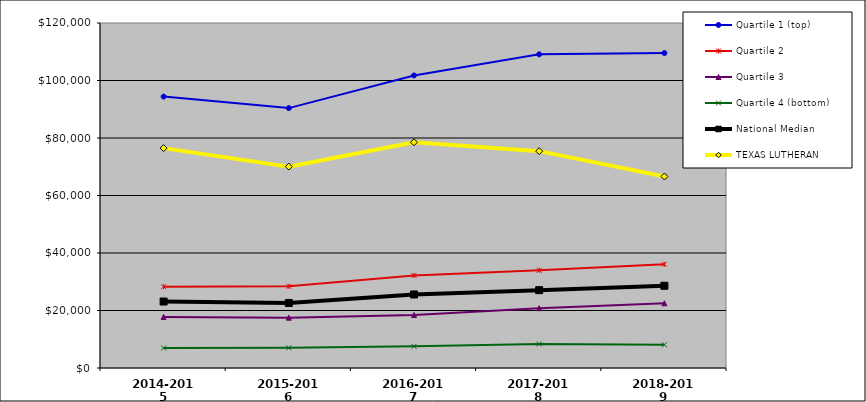
| Category | Quartile 1 (top) | Quartile 2 | Quartile 3 | Quartile 4 (bottom) | National Median | TEXAS LUTHERAN |
|---|---|---|---|---|---|---|
| 2014-2015 | 94399.01 | 28261.992 | 17755.456 | 6924.092 | 23117.708 | 76478.341 |
| 2015-2016 | 90397.525 | 28392.69 | 17505.731 | 7027.323 | 22619.893 | 70047.888 |
| 2016-2017 | 101759.222 | 32192.978 | 18460.041 | 7536.846 | 25581.053 | 78508.712 |
| 2017-2018 | 109099.801 | 33978.185 | 20808.892 | 8356.122 | 27067.87 | 75423 |
| 2018-2019 | 109542.756 | 36085.918 | 22501.748 | 8097.65 | 28604.166 | 66606.85 |